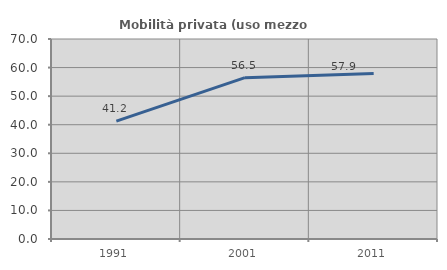
| Category | Mobilità privata (uso mezzo privato) |
|---|---|
| 1991.0 | 41.244 |
| 2001.0 | 56.46 |
| 2011.0 | 57.937 |